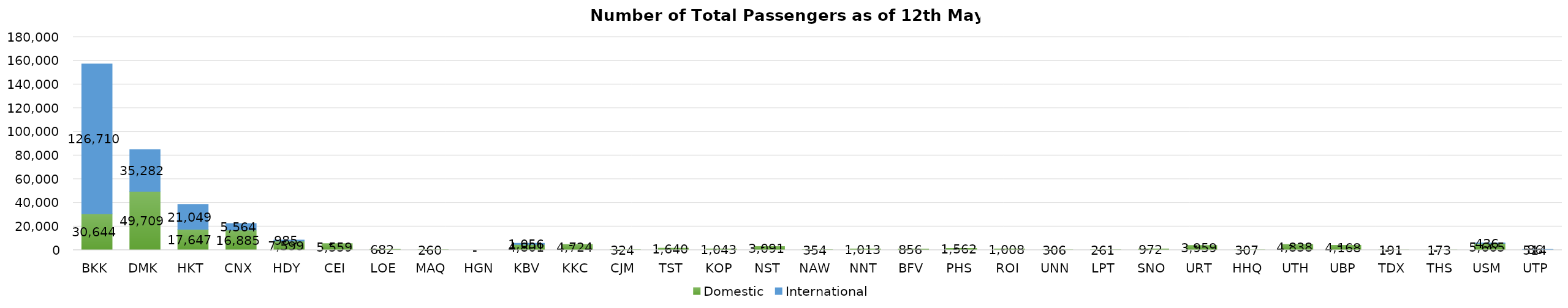
| Category | Domestic | International |
|---|---|---|
| BKK | 30644 | 126710 |
| DMK | 49709 | 35282 |
| HKT | 17647 | 21049 |
| CNX | 16885 | 5564 |
| HDY | 7599 | 985 |
| CEI | 5559 | 0 |
| LOE | 682 | 0 |
| MAQ | 260 | 0 |
| HGN | 0 | 0 |
| KBV | 4801 | 1056 |
| KKC | 4724 | 0 |
| CJM | 324 | 0 |
| TST | 1640 | 0 |
| KOP | 1043 | 0 |
| NST | 3091 | 0 |
| NAW | 354 | 0 |
| NNT | 1013 | 0 |
| BFV | 856 | 0 |
| PHS | 1562 | 0 |
| ROI | 1008 | 0 |
| UNN | 306 | 0 |
| LPT | 261 | 0 |
| SNO | 972 | 0 |
| URT | 3959 | 0 |
| HHQ | 307 | 0 |
| UTH | 4838 | 0 |
| UBP | 4168 | 0 |
| TDX | 191 | 0 |
| THS | 173 | 0 |
| USM | 5665 | 436 |
| UTP | 514 | 86 |